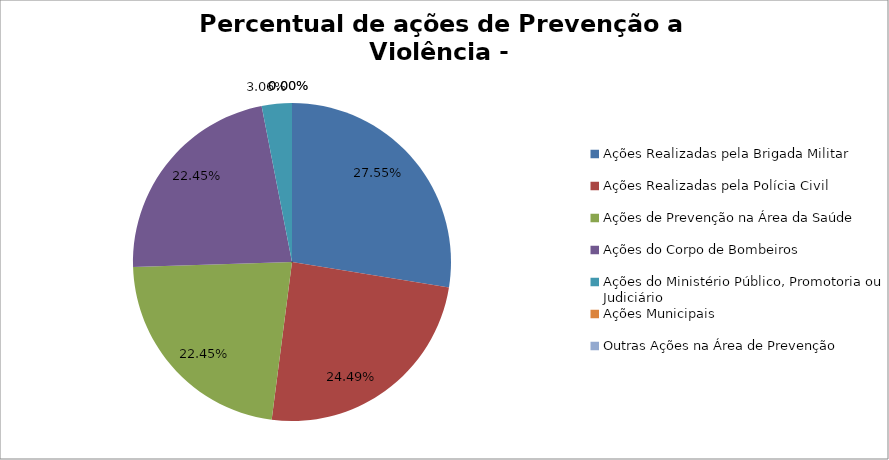
| Category | Percentual |
|---|---|
| Ações Realizadas pela Brigada Militar | 0.276 |
| Ações Realizadas pela Polícia Civil | 0.245 |
| Ações de Prevenção na Área da Saúde | 0.224 |
| Ações do Corpo de Bombeiros | 0.224 |
| Ações do Ministério Público, Promotoria ou Judiciário | 0.031 |
| Ações Municipais | 0 |
| Outras Ações na Área de Prevenção | 0 |